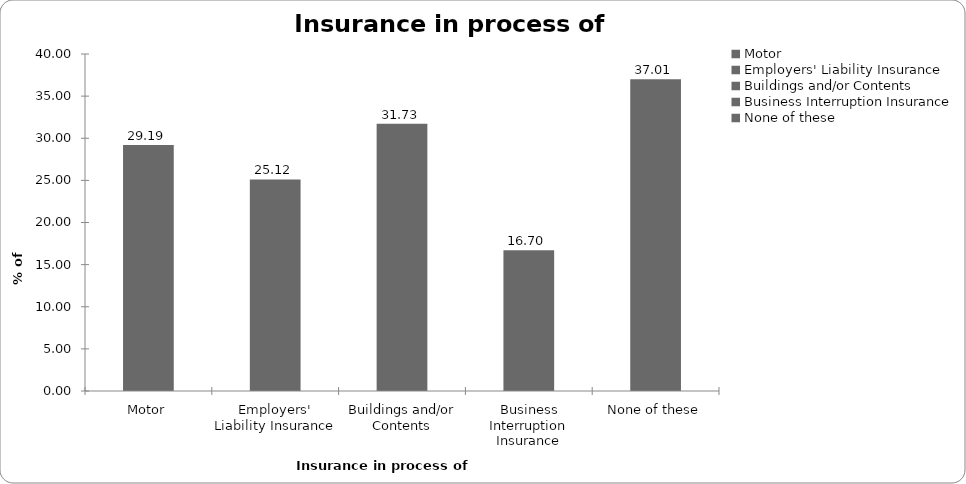
| Category | Insurance in process of buying |
|---|---|
| Motor | 29.192 |
| Employers' Liability Insurance | 25.117 |
| Buildings and/or Contents | 31.73 |
| Business Interruption Insurance | 16.7 |
| None of these | 37.007 |